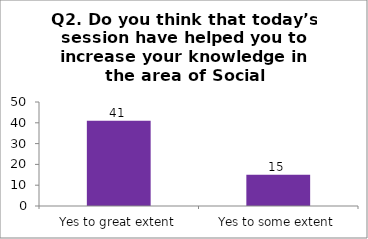
| Category | Q2. Do you think that today’s session have helped you to increase your knowledge in the area of Social Entrepreneurship? |
|---|---|
| Yes to great extent | 41 |
| Yes to some extent | 15 |